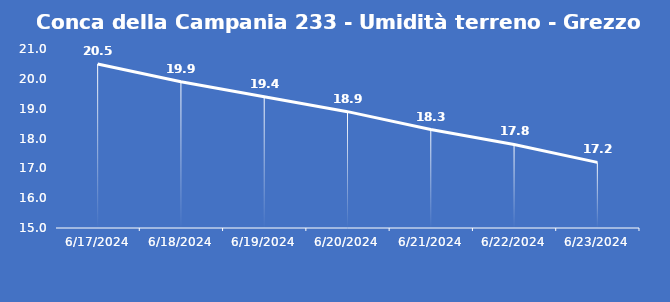
| Category | Conca della Campania 233 - Umidità terreno - Grezzo (%VWC) |
|---|---|
| 6/17/24 | 20.5 |
| 6/18/24 | 19.9 |
| 6/19/24 | 19.4 |
| 6/20/24 | 18.9 |
| 6/21/24 | 18.3 |
| 6/22/24 | 17.8 |
| 6/23/24 | 17.2 |